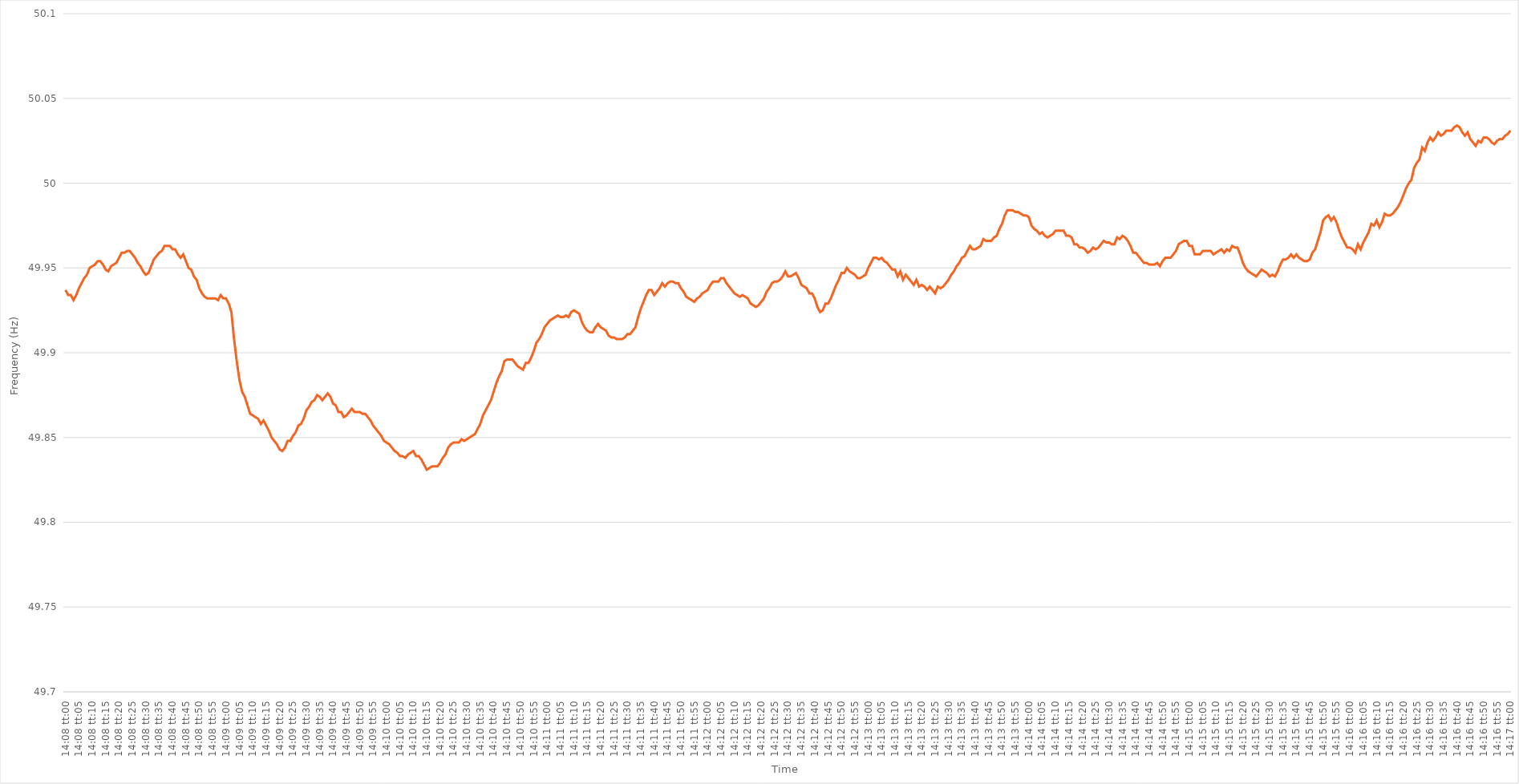
| Category | Series 0 |
|---|---|
| 0.5888888888888889 | 49.937 |
| 0.588900462962963 | 49.934 |
| 0.588912037037037 | 49.934 |
| 0.5889236111111111 | 49.931 |
| 0.5889351851851852 | 49.934 |
| 0.5889467592592593 | 49.938 |
| 0.5889583333333334 | 49.941 |
| 0.5889699074074074 | 49.944 |
| 0.5889814814814814 | 49.946 |
| 0.5889930555555556 | 49.95 |
| 0.5890046296296296 | 49.951 |
| 0.5890162037037037 | 49.952 |
| 0.5890277777777778 | 49.954 |
| 0.5890393518518519 | 49.954 |
| 0.5890509259259259 | 49.952 |
| 0.5890624999999999 | 49.949 |
| 0.5890740740740741 | 49.948 |
| 0.5890856481481481 | 49.951 |
| 0.5890972222222223 | 49.952 |
| 0.5891087962962963 | 49.953 |
| 0.5891203703703703 | 49.956 |
| 0.5891319444444444 | 49.959 |
| 0.5891435185185185 | 49.959 |
| 0.5891550925925926 | 49.96 |
| 0.5891666666666667 | 49.96 |
| 0.5891782407407408 | 49.958 |
| 0.5891898148148148 | 49.956 |
| 0.5892013888888888 | 49.953 |
| 0.589212962962963 | 49.951 |
| 0.589224537037037 | 49.948 |
| 0.5892361111111112 | 49.946 |
| 0.5892476851851852 | 49.947 |
| 0.5892592592592593 | 49.951 |
| 0.5892708333333333 | 49.955 |
| 0.5892824074074073 | 49.957 |
| 0.5892939814814815 | 49.959 |
| 0.5893055555555555 | 49.96 |
| 0.5893171296296297 | 49.963 |
| 0.5893287037037037 | 49.963 |
| 0.5893402777777778 | 49.963 |
| 0.5893518518518518 | 49.961 |
| 0.5893634259259259 | 49.961 |
| 0.589375 | 49.958 |
| 0.5893865740740741 | 49.956 |
| 0.5893981481481482 | 49.958 |
| 0.5894097222222222 | 49.954 |
| 0.5894212962962962 | 49.95 |
| 0.5894328703703704 | 49.949 |
| 0.5894444444444444 | 49.945 |
| 0.5894560185185186 | 49.943 |
| 0.5894675925925926 | 49.938 |
| 0.5894791666666667 | 49.935 |
| 0.5894907407407407 | 49.933 |
| 0.5895023148148147 | 49.932 |
| 0.5895138888888889 | 49.932 |
| 0.5895254629629629 | 49.932 |
| 0.5895370370370371 | 49.932 |
| 0.5895486111111111 | 49.931 |
| 0.5895601851851852 | 49.934 |
| 0.5895717592592592 | 49.932 |
| 0.5895833333333333 | 49.932 |
| 0.5895949074074074 | 49.929 |
| 0.5896064814814815 | 49.924 |
| 0.5896180555555556 | 49.908 |
| 0.5896296296296296 | 49.895 |
| 0.5896412037037037 | 49.884 |
| 0.5896527777777778 | 49.877 |
| 0.5896643518518518 | 49.874 |
| 0.589675925925926 | 49.869 |
| 0.5896875 | 49.864 |
| 0.5896990740740741 | 49.863 |
| 0.5897106481481481 | 49.862 |
| 0.5897222222222221 | 49.861 |
| 0.5897337962962963 | 49.858 |
| 0.5897453703703703 | 49.86 |
| 0.5897569444444445 | 49.857 |
| 0.5897685185185185 | 49.854 |
| 0.5897800925925926 | 49.85 |
| 0.5897916666666666 | 49.848 |
| 0.5898032407407408 | 49.846 |
| 0.5898148148148148 | 49.843 |
| 0.5898263888888889 | 49.842 |
| 0.589837962962963 | 49.844 |
| 0.589849537037037 | 49.848 |
| 0.5898611111111111 | 49.848 |
| 0.5898726851851852 | 49.851 |
| 0.5898842592592592 | 49.853 |
| 0.5898958333333334 | 49.857 |
| 0.5899074074074074 | 49.858 |
| 0.5899189814814815 | 49.861 |
| 0.5899305555555555 | 49.866 |
| 0.5899421296296297 | 49.868 |
| 0.5899537037037037 | 49.871 |
| 0.5899652777777779 | 49.872 |
| 0.5899768518518519 | 49.875 |
| 0.5899884259259259 | 49.874 |
| 0.59 | 49.872 |
| 0.590011574074074 | 49.874 |
| 0.5900231481481482 | 49.876 |
| 0.5900347222222222 | 49.874 |
| 0.5900462962962963 | 49.87 |
| 0.5900578703703704 | 49.869 |
| 0.5900694444444444 | 49.865 |
| 0.5900810185185185 | 49.865 |
| 0.5900925925925926 | 49.862 |
| 0.5901041666666667 | 49.863 |
| 0.5901157407407408 | 49.865 |
| 0.5901273148148148 | 49.867 |
| 0.5901388888888889 | 49.865 |
| 0.5901504629629629 | 49.865 |
| 0.5901620370370371 | 49.865 |
| 0.5901736111111111 | 49.864 |
| 0.5901851851851853 | 49.864 |
| 0.5901967592592593 | 49.862 |
| 0.5902083333333333 | 49.86 |
| 0.5902199074074074 | 49.857 |
| 0.5902314814814814 | 49.855 |
| 0.5902430555555556 | 49.853 |
| 0.5902546296296296 | 49.851 |
| 0.5902662037037038 | 49.848 |
| 0.5902777777777778 | 49.847 |
| 0.5902893518518518 | 49.846 |
| 0.5903009259259259 | 49.844 |
| 0.5903125 | 49.842 |
| 0.5903240740740741 | 49.841 |
| 0.5903356481481482 | 49.839 |
| 0.5903472222222222 | 49.839 |
| 0.5903587962962963 | 49.838 |
| 0.5903703703703703 | 49.84 |
| 0.5903819444444445 | 49.841 |
| 0.5903935185185185 | 49.842 |
| 0.5904050925925927 | 49.839 |
| 0.5904166666666667 | 49.839 |
| 0.5904282407407407 | 49.837 |
| 0.5904398148148148 | 49.834 |
| 0.5904513888888888 | 49.831 |
| 0.590462962962963 | 49.832 |
| 0.590474537037037 | 49.833 |
| 0.5904861111111112 | 49.833 |
| 0.5904976851851852 | 49.833 |
| 0.5905092592592592 | 49.835 |
| 0.5905208333333333 | 49.838 |
| 0.5905324074074074 | 49.84 |
| 0.5905439814814815 | 49.844 |
| 0.5905555555555556 | 49.846 |
| 0.5905671296296297 | 49.847 |
| 0.5905787037037037 | 49.847 |
| 0.5905902777777777 | 49.847 |
| 0.5906018518518519 | 49.849 |
| 0.5906134259259259 | 49.848 |
| 0.5906250000000001 | 49.849 |
| 0.5906365740740741 | 49.85 |
| 0.5906481481481481 | 49.851 |
| 0.5906597222222222 | 49.852 |
| 0.5906712962962963 | 49.855 |
| 0.5906828703703704 | 49.858 |
| 0.5906944444444444 | 49.863 |
| 0.5907060185185186 | 49.866 |
| 0.5907175925925926 | 49.869 |
| 0.5907291666666666 | 49.872 |
| 0.5907407407407407 | 49.877 |
| 0.5907523148148148 | 49.882 |
| 0.5907638888888889 | 49.886 |
| 0.590775462962963 | 49.889 |
| 0.590787037037037 | 49.895 |
| 0.5907986111111111 | 49.896 |
| 0.5908101851851851 | 49.896 |
| 0.5908217592592593 | 49.896 |
| 0.5908333333333333 | 49.894 |
| 0.5908449074074075 | 49.892 |
| 0.5908564814814815 | 49.891 |
| 0.5908680555555555 | 49.89 |
| 0.5908796296296296 | 49.894 |
| 0.5908912037037037 | 49.894 |
| 0.5909027777777778 | 49.897 |
| 0.5909143518518518 | 49.901 |
| 0.590925925925926 | 49.906 |
| 0.5909375 | 49.908 |
| 0.590949074074074 | 49.911 |
| 0.5909606481481481 | 49.915 |
| 0.5909722222222222 | 49.917 |
| 0.5909837962962963 | 49.919 |
| 0.5909953703703704 | 49.92 |
| 0.5910069444444445 | 49.921 |
| 0.5910185185185185 | 49.922 |
| 0.5910300925925925 | 49.921 |
| 0.5910416666666667 | 49.921 |
| 0.5910532407407407 | 49.922 |
| 0.5910648148148149 | 49.921 |
| 0.5910763888888889 | 49.924 |
| 0.591087962962963 | 49.925 |
| 0.591099537037037 | 49.924 |
| 0.5911111111111111 | 49.923 |
| 0.5911226851851852 | 49.918 |
| 0.5911342592592593 | 49.915 |
| 0.5911458333333334 | 49.913 |
| 0.5911574074074074 | 49.912 |
| 0.5911689814814814 | 49.912 |
| 0.5911805555555555 | 49.915 |
| 0.5911921296296296 | 49.917 |
| 0.5912037037037037 | 49.915 |
| 0.5912152777777778 | 49.914 |
| 0.5912268518518519 | 49.913 |
| 0.5912384259259259 | 49.91 |
| 0.5912499999999999 | 49.909 |
| 0.5912615740740741 | 49.909 |
| 0.5912731481481481 | 49.908 |
| 0.5912847222222223 | 49.908 |
| 0.5912962962962963 | 49.908 |
| 0.5913078703703704 | 49.909 |
| 0.5913194444444444 | 49.911 |
| 0.5913310185185185 | 49.911 |
| 0.5913425925925926 | 49.913 |
| 0.5913541666666667 | 49.915 |
| 0.5913657407407408 | 49.921 |
| 0.5913773148148148 | 49.926 |
| 0.5913888888888889 | 49.93 |
| 0.5914004629629629 | 49.934 |
| 0.591412037037037 | 49.937 |
| 0.5914236111111111 | 49.937 |
| 0.5914351851851852 | 49.934 |
| 0.5914467592592593 | 49.936 |
| 0.5914583333333333 | 49.938 |
| 0.5914699074074073 | 49.941 |
| 0.5914814814814815 | 49.939 |
| 0.5914930555555555 | 49.941 |
| 0.5915046296296297 | 49.942 |
| 0.5915162037037037 | 49.942 |
| 0.5915277777777778 | 49.941 |
| 0.5915393518518518 | 49.941 |
| 0.591550925925926 | 49.938 |
| 0.5915625 | 49.936 |
| 0.5915740740740741 | 49.933 |
| 0.5915856481481482 | 49.932 |
| 0.5915972222222222 | 49.931 |
| 0.5916087962962963 | 49.93 |
| 0.5916203703703703 | 49.932 |
| 0.5916319444444444 | 49.933 |
| 0.5916435185185185 | 49.935 |
| 0.5916550925925926 | 49.936 |
| 0.5916666666666667 | 49.937 |
| 0.5916782407407407 | 49.94 |
| 0.5916898148148148 | 49.942 |
| 0.5917013888888889 | 49.942 |
| 0.5917129629629629 | 49.942 |
| 0.5917245370370371 | 49.944 |
| 0.5917361111111111 | 49.944 |
| 0.5917476851851852 | 49.941 |
| 0.5917592592592592 | 49.939 |
| 0.5917708333333334 | 49.937 |
| 0.5917824074074074 | 49.935 |
| 0.5917939814814815 | 49.934 |
| 0.5918055555555556 | 49.933 |
| 0.5918171296296296 | 49.934 |
| 0.5918287037037037 | 49.933 |
| 0.5918402777777778 | 49.932 |
| 0.5918518518518519 | 49.929 |
| 0.5918634259259259 | 49.928 |
| 0.591875 | 49.927 |
| 0.5918865740740741 | 49.928 |
| 0.5918981481481481 | 49.93 |
| 0.5919097222222222 | 49.932 |
| 0.5919212962962963 | 49.936 |
| 0.5919328703703703 | 49.938 |
| 0.5919444444444445 | 49.941 |
| 0.5919560185185185 | 49.942 |
| 0.5919675925925926 | 49.942 |
| 0.5919791666666666 | 49.943 |
| 0.5919907407407408 | 49.945 |
| 0.5920023148148148 | 49.948 |
| 0.592013888888889 | 49.945 |
| 0.592025462962963 | 49.945 |
| 0.592037037037037 | 49.946 |
| 0.5920486111111111 | 49.947 |
| 0.5920601851851852 | 49.944 |
| 0.5920717592592593 | 49.94 |
| 0.5920833333333334 | 49.939 |
| 0.5920949074074074 | 49.938 |
| 0.5921064814814815 | 49.935 |
| 0.5921180555555555 | 49.935 |
| 0.5921296296296296 | 49.932 |
| 0.5921412037037037 | 49.927 |
| 0.5921527777777778 | 49.924 |
| 0.5921643518518519 | 49.925 |
| 0.5921759259259259 | 49.929 |
| 0.5921875 | 49.929 |
| 0.592199074074074 | 49.932 |
| 0.5922106481481482 | 49.936 |
| 0.5922222222222222 | 49.94 |
| 0.5922337962962964 | 49.943 |
| 0.5922453703703704 | 49.947 |
| 0.5922569444444444 | 49.947 |
| 0.5922685185185185 | 49.95 |
| 0.5922800925925926 | 49.948 |
| 0.5922916666666667 | 49.947 |
| 0.5923032407407408 | 49.946 |
| 0.5923148148148148 | 49.944 |
| 0.5923263888888889 | 49.944 |
| 0.5923379629629629 | 49.945 |
| 0.592349537037037 | 49.946 |
| 0.5923611111111111 | 49.95 |
| 0.5923726851851852 | 49.953 |
| 0.5923842592592593 | 49.956 |
| 0.5923958333333333 | 49.956 |
| 0.5924074074074074 | 49.955 |
| 0.5924189814814814 | 49.956 |
| 0.5924305555555556 | 49.954 |
| 0.5924421296296296 | 49.953 |
| 0.5924537037037038 | 49.951 |
| 0.5924652777777778 | 49.949 |
| 0.5924768518518518 | 49.949 |
| 0.5924884259259259 | 49.945 |
| 0.5925 | 49.948 |
| 0.5925115740740741 | 49.943 |
| 0.5925231481481482 | 49.946 |
| 0.5925347222222223 | 49.944 |
| 0.5925462962962963 | 49.942 |
| 0.5925578703703703 | 49.94 |
| 0.5925694444444445 | 49.943 |
| 0.5925810185185185 | 49.939 |
| 0.5925925925925926 | 49.94 |
| 0.5926041666666667 | 49.939 |
| 0.5926157407407407 | 49.937 |
| 0.5926273148148148 | 49.939 |
| 0.5926388888888888 | 49.937 |
| 0.592650462962963 | 49.935 |
| 0.592662037037037 | 49.939 |
| 0.5926736111111112 | 49.938 |
| 0.5926851851851852 | 49.939 |
| 0.5926967592592592 | 49.941 |
| 0.5927083333333333 | 49.943 |
| 0.5927199074074074 | 49.946 |
| 0.5927314814814815 | 49.948 |
| 0.5927430555555556 | 49.951 |
| 0.5927546296296297 | 49.953 |
| 0.5927662037037037 | 49.956 |
| 0.5927777777777777 | 49.957 |
| 0.5927893518518519 | 49.96 |
| 0.5928009259259259 | 49.963 |
| 0.5928125 | 49.961 |
| 0.5928240740740741 | 49.961 |
| 0.5928356481481482 | 49.962 |
| 0.5928472222222222 | 49.963 |
| 0.5928587962962962 | 49.967 |
| 0.5928703703703704 | 49.966 |
| 0.5928819444444444 | 49.966 |
| 0.5928935185185186 | 49.966 |
| 0.5929050925925926 | 49.968 |
| 0.5929166666666666 | 49.969 |
| 0.5929282407407407 | 49.973 |
| 0.5929398148148148 | 49.976 |
| 0.5929513888888889 | 49.981 |
| 0.592962962962963 | 49.984 |
| 0.5929745370370371 | 49.984 |
| 0.5929861111111111 | 49.984 |
| 0.5929976851851851 | 49.983 |
| 0.5930092592592593 | 49.983 |
| 0.5930208333333333 | 49.982 |
| 0.5930324074074075 | 49.981 |
| 0.5930439814814815 | 49.981 |
| 0.5930555555555556 | 49.98 |
| 0.5930671296296296 | 49.975 |
| 0.5930787037037036 | 49.973 |
| 0.5930902777777778 | 49.972 |
| 0.5931018518518518 | 49.97 |
| 0.593113425925926 | 49.971 |
| 0.593125 | 49.969 |
| 0.593136574074074 | 49.968 |
| 0.5931481481481481 | 49.969 |
| 0.5931597222222222 | 49.97 |
| 0.5931712962962963 | 49.972 |
| 0.5931828703703704 | 49.972 |
| 0.5931944444444445 | 49.972 |
| 0.5932060185185185 | 49.972 |
| 0.5932175925925925 | 49.969 |
| 0.5932291666666667 | 49.969 |
| 0.5932407407407407 | 49.968 |
| 0.5932523148148149 | 49.964 |
| 0.5932638888888889 | 49.964 |
| 0.593275462962963 | 49.962 |
| 0.593287037037037 | 49.962 |
| 0.593298611111111 | 49.961 |
| 0.5933101851851852 | 49.959 |
| 0.5933217592592592 | 49.96 |
| 0.5933333333333334 | 49.962 |
| 0.5933449074074074 | 49.961 |
| 0.5933564814814815 | 49.962 |
| 0.5933680555555555 | 49.964 |
| 0.5933796296296296 | 49.966 |
| 0.5933912037037037 | 49.965 |
| 0.5934027777777778 | 49.965 |
| 0.5934143518518519 | 49.964 |
| 0.5934259259259259 | 49.964 |
| 0.5934375 | 49.968 |
| 0.5934490740740741 | 49.967 |
| 0.5934606481481481 | 49.969 |
| 0.5934722222222223 | 49.968 |
| 0.5934837962962963 | 49.966 |
| 0.5934953703703704 | 49.963 |
| 0.5935069444444444 | 49.959 |
| 0.5935185185185184 | 49.959 |
| 0.5935300925925926 | 49.957 |
| 0.5935416666666666 | 49.955 |
| 0.5935532407407408 | 49.953 |
| 0.5935648148148148 | 49.953 |
| 0.5935763888888889 | 49.952 |
| 0.5935879629629629 | 49.952 |
| 0.593599537037037 | 49.952 |
| 0.5936111111111111 | 49.953 |
| 0.5936226851851852 | 49.951 |
| 0.5936342592592593 | 49.954 |
| 0.5936458333333333 | 49.956 |
| 0.5936574074074074 | 49.956 |
| 0.5936689814814815 | 49.956 |
| 0.5936805555555555 | 49.958 |
| 0.5936921296296297 | 49.96 |
| 0.5937037037037037 | 49.964 |
| 0.5937152777777778 | 49.965 |
| 0.5937268518518518 | 49.966 |
| 0.593738425925926 | 49.966 |
| 0.59375 | 49.963 |
| 0.593761574074074 | 49.963 |
| 0.5937731481481482 | 49.958 |
| 0.5937847222222222 | 49.958 |
| 0.5937962962962963 | 49.958 |
| 0.5938078703703703 | 49.96 |
| 0.5938194444444445 | 49.96 |
| 0.5938310185185185 | 49.96 |
| 0.5938425925925926 | 49.96 |
| 0.5938541666666667 | 49.958 |
| 0.5938657407407407 | 49.959 |
| 0.5938773148148148 | 49.96 |
| 0.5938888888888889 | 49.961 |
| 0.593900462962963 | 49.959 |
| 0.5939120370370371 | 49.961 |
| 0.5939236111111111 | 49.96 |
| 0.5939351851851852 | 49.963 |
| 0.5939467592592592 | 49.962 |
| 0.5939583333333334 | 49.962 |
| 0.5939699074074074 | 49.958 |
| 0.5939814814814816 | 49.953 |
| 0.5939930555555556 | 49.95 |
| 0.5940046296296296 | 49.948 |
| 0.5940162037037037 | 49.947 |
| 0.5940277777777777 | 49.946 |
| 0.5940393518518519 | 49.945 |
| 0.5940509259259259 | 49.947 |
| 0.5940625 | 49.949 |
| 0.5940740740740741 | 49.948 |
| 0.5940856481481481 | 49.947 |
| 0.5940972222222222 | 49.945 |
| 0.5941087962962963 | 49.946 |
| 0.5941203703703704 | 49.945 |
| 0.5941319444444445 | 49.948 |
| 0.5941435185185185 | 49.952 |
| 0.5941550925925926 | 49.955 |
| 0.5941666666666666 | 49.955 |
| 0.5941782407407408 | 49.956 |
| 0.5941898148148148 | 49.958 |
| 0.594201388888889 | 49.956 |
| 0.594212962962963 | 49.958 |
| 0.594224537037037 | 49.956 |
| 0.5942361111111111 | 49.955 |
| 0.5942476851851851 | 49.954 |
| 0.5942592592592593 | 49.954 |
| 0.5942708333333333 | 49.955 |
| 0.5942824074074075 | 49.959 |
| 0.5942939814814815 | 49.961 |
| 0.5943055555555555 | 49.966 |
| 0.5943171296296296 | 49.971 |
| 0.5943287037037037 | 49.978 |
| 0.5943402777777778 | 49.98 |
| 0.5943518518518519 | 49.981 |
| 0.594363425925926 | 49.978 |
| 0.594375 | 49.98 |
| 0.594386574074074 | 49.977 |
| 0.5943981481481482 | 49.972 |
| 0.5944097222222222 | 49.968 |
| 0.5944212962962964 | 49.965 |
| 0.5944328703703704 | 49.962 |
| 0.5944444444444444 | 49.962 |
| 0.5944560185185185 | 49.961 |
| 0.5944675925925926 | 49.959 |
| 0.5944791666666667 | 49.964 |
| 0.5944907407407407 | 49.961 |
| 0.5945023148148149 | 49.965 |
| 0.5945138888888889 | 49.968 |
| 0.5945254629629629 | 49.971 |
| 0.594537037037037 | 49.976 |
| 0.5945486111111111 | 49.975 |
| 0.5945601851851852 | 49.978 |
| 0.5945717592592593 | 49.974 |
| 0.5945833333333334 | 49.977 |
| 0.5945949074074074 | 49.982 |
| 0.5946064814814814 | 49.981 |
| 0.5946180555555556 | 49.981 |
| 0.5946296296296296 | 49.982 |
| 0.5946412037037038 | 49.984 |
| 0.5946527777777778 | 49.986 |
| 0.5946643518518518 | 49.989 |
| 0.5946759259259259 | 49.993 |
| 0.5946875 | 49.997 |
| 0.5946990740740741 | 50 |
| 0.5947106481481481 | 50.002 |
| 0.5947222222222223 | 50.009 |
| 0.5947337962962963 | 50.012 |
| 0.5947453703703703 | 50.014 |
| 0.5947569444444444 | 50.021 |
| 0.5947685185185185 | 50.019 |
| 0.5947800925925926 | 50.024 |
| 0.5947916666666667 | 50.027 |
| 0.5948032407407408 | 50.025 |
| 0.5948148148148148 | 50.027 |
| 0.5948263888888888 | 50.03 |
| 0.594837962962963 | 50.028 |
| 0.594849537037037 | 50.029 |
| 0.5948611111111112 | 50.031 |
| 0.5948726851851852 | 50.031 |
| 0.5948842592592593 | 50.031 |
| 0.5948958333333333 | 50.033 |
| 0.5949074074074074 | 50.034 |
| 0.5949189814814815 | 50.033 |
| 0.5949305555555555 | 50.03 |
| 0.5949421296296297 | 50.028 |
| 0.5949537037037037 | 50.03 |
| 0.5949652777777777 | 50.026 |
| 0.5949768518518518 | 50.024 |
| 0.5949884259259259 | 50.022 |
| 0.595 | 50.025 |
| 0.5950115740740741 | 50.024 |
| 0.5950231481481482 | 50.027 |
| 0.5950347222222222 | 50.027 |
| 0.5950462962962962 | 50.026 |
| 0.5950578703703704 | 50.024 |
| 0.5950694444444444 | 50.023 |
| 0.5950810185185186 | 50.025 |
| 0.5950925925925926 | 50.026 |
| 0.5951041666666667 | 50.026 |
| 0.5951157407407407 | 50.028 |
| 0.5951273148148148 | 50.029 |
| 0.5951388888888889 | 50.031 |